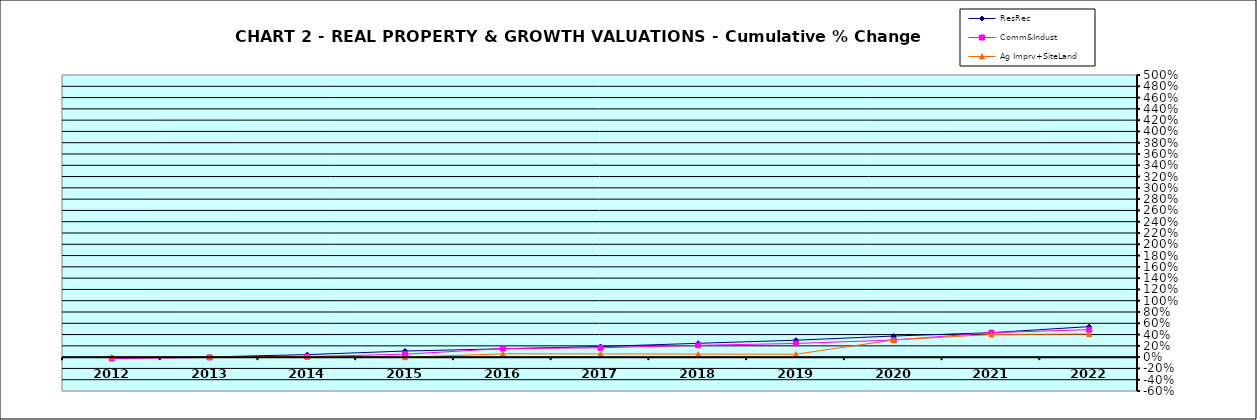
| Category | ResRec | Comm&Indust | Ag Imprv+SiteLand |
|---|---|---|---|
| 2012.0 | -0.012 | -0.024 | 0 |
| 2013.0 | 0.004 | -0.005 | 0.004 |
| 2014.0 | 0.045 | 0.01 | 0.01 |
| 2015.0 | 0.108 | 0.052 | -0.002 |
| 2016.0 | 0.147 | 0.152 | 0.059 |
| 2017.0 | 0.188 | 0.165 | 0.058 |
| 2018.0 | 0.245 | 0.209 | 0.054 |
| 2019.0 | 0.3 | 0.242 | 0.052 |
| 2020.0 | 0.374 | 0.303 | 0.305 |
| 2021.0 | 0.434 | 0.434 | 0.402 |
| 2022.0 | 0.541 | 0.487 | 0.41 |